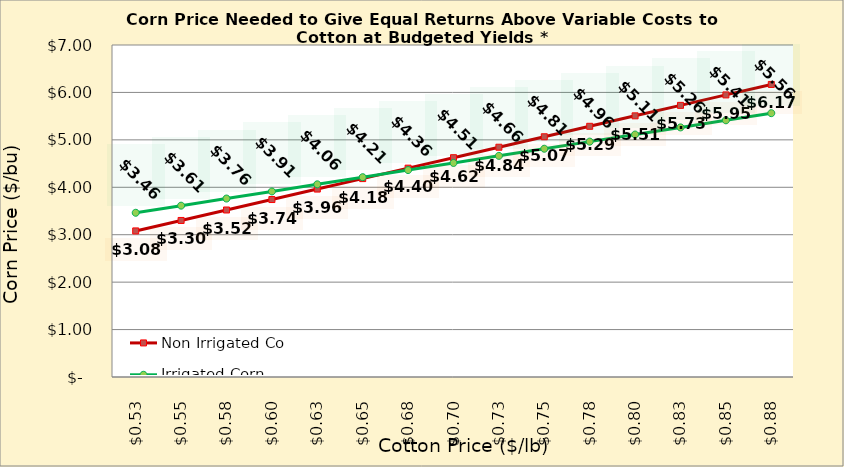
| Category | Non Irrigated Corn | Irrigated Corn |
|---|---|---|
| 0.5249999999999998 | 3.08 | 3.463 |
| 0.5499999999999998 | 3.301 | 3.613 |
| 0.5749999999999998 | 3.521 | 3.763 |
| 0.5999999999999999 | 3.742 | 3.913 |
| 0.6249999999999999 | 3.962 | 4.063 |
| 0.6499999999999999 | 4.183 | 4.213 |
| 0.6749999999999999 | 4.404 | 4.363 |
| 0.7 | 4.624 | 4.513 |
| 0.725 | 4.845 | 4.663 |
| 0.75 | 5.065 | 4.813 |
| 0.775 | 5.286 | 4.963 |
| 0.8 | 5.506 | 5.113 |
| 0.8250000000000001 | 5.727 | 5.263 |
| 0.8500000000000001 | 5.948 | 5.413 |
| 0.8750000000000001 | 6.168 | 5.563 |